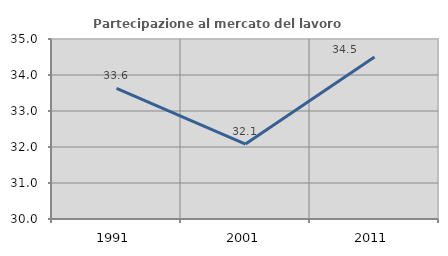
| Category | Partecipazione al mercato del lavoro  femminile |
|---|---|
| 1991.0 | 33.631 |
| 2001.0 | 32.082 |
| 2011.0 | 34.502 |